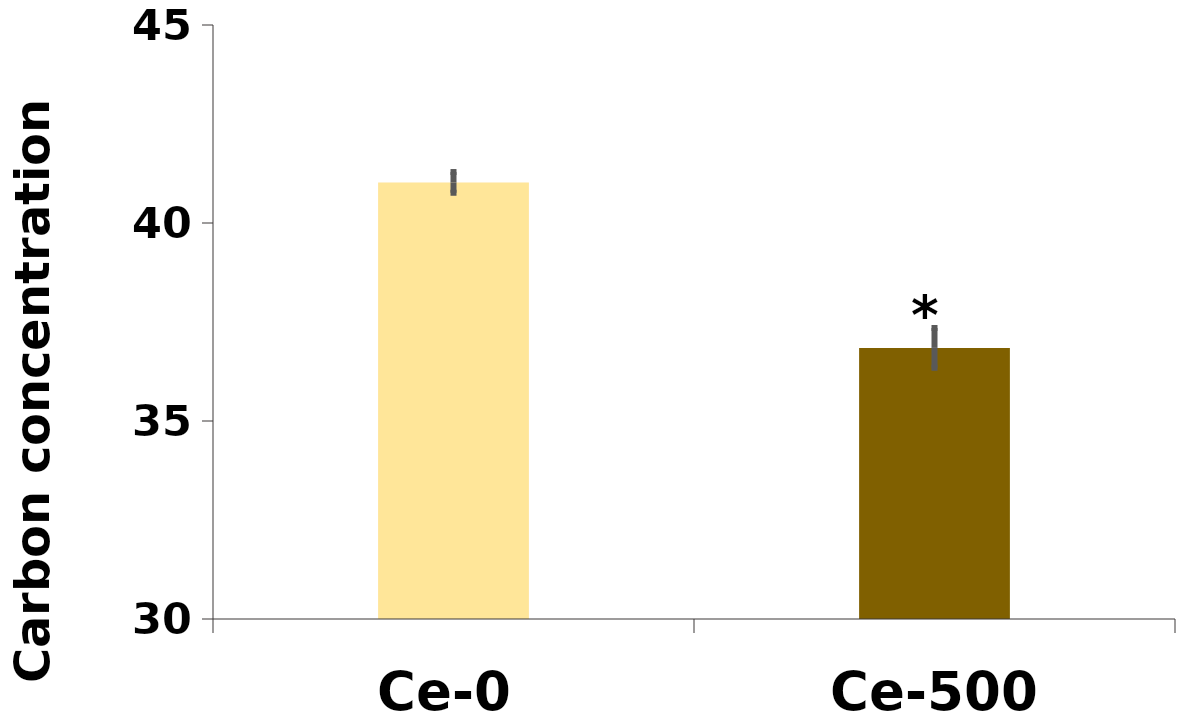
| Category | %C |
|---|---|
| Ce-0 | 41.025 |
| Ce-500 | 36.846 |